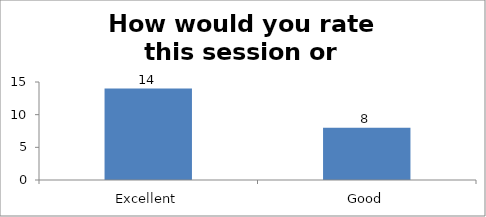
| Category | How would you rate this session or workshop? |
|---|---|
| Excellent | 14 |
| Good | 8 |